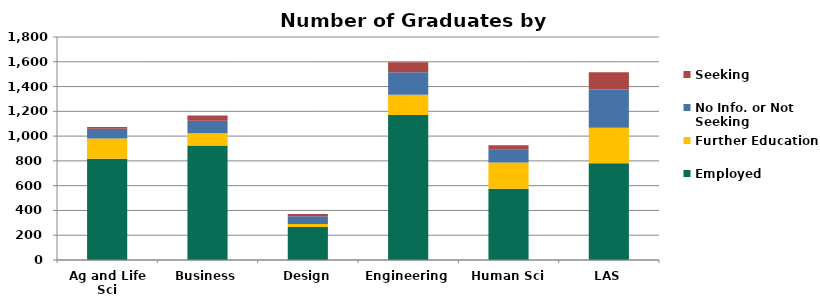
| Category | Employed | Further Education | No Info. or Not Seeking | Seeking |
|---|---|---|---|---|
| Ag and Life Sci | 817 | 163 | 79 | 15 |
| Business | 924 | 100 | 100 | 42 |
| Design | 266 | 25 | 63 | 17 |
| Engineering | 1170 | 163 | 183 | 81 |
| Human Sci | 576 | 211 | 103 | 37 |
| LAS | 780 | 288 | 308 | 140 |